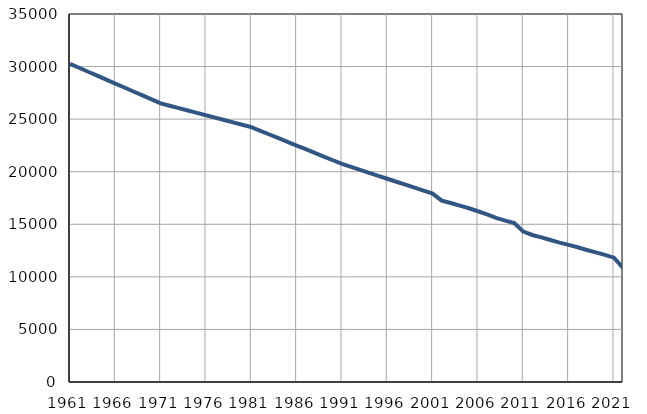
| Category | Број
становника |
|---|---|
| 1961.0 | 30260 |
| 1962.0 | 29885 |
| 1963.0 | 29509 |
| 1964.0 | 29134 |
| 1965.0 | 28758 |
| 1966.0 | 28383 |
| 1967.0 | 28007 |
| 1968.0 | 27632 |
| 1969.0 | 27256 |
| 1970.0 | 26881 |
| 1971.0 | 26505 |
| 1972.0 | 26279 |
| 1973.0 | 26052 |
| 1974.0 | 25826 |
| 1975.0 | 25600 |
| 1976.0 | 25374 |
| 1977.0 | 25147 |
| 1978.0 | 24920 |
| 1979.0 | 24694 |
| 1980.0 | 24467 |
| 1981.0 | 24242 |
| 1982.0 | 23892 |
| 1983.0 | 23541 |
| 1984.0 | 23191 |
| 1985.0 | 22841 |
| 1986.0 | 22490 |
| 1987.0 | 22141 |
| 1988.0 | 21790 |
| 1989.0 | 21440 |
| 1990.0 | 21090 |
| 1991.0 | 20740 |
| 1992.0 | 20458 |
| 1993.0 | 20176 |
| 1994.0 | 19894 |
| 1995.0 | 19611 |
| 1996.0 | 19330 |
| 1997.0 | 19047 |
| 1998.0 | 18765 |
| 1999.0 | 18483 |
| 2000.0 | 18201 |
| 2001.0 | 17919 |
| 2002.0 | 17248 |
| 2003.0 | 17022 |
| 2004.0 | 16779 |
| 2005.0 | 16525 |
| 2006.0 | 16240 |
| 2007.0 | 15935 |
| 2008.0 | 15617 |
| 2009.0 | 15344 |
| 2010.0 | 15112 |
| 2011.0 | 14304 |
| 2012.0 | 13982 |
| 2013.0 | 13755 |
| 2014.0 | 13507 |
| 2015.0 | 13255 |
| 2016.0 | 13037 |
| 2017.0 | 12811 |
| 2018.0 | 12557 |
| 2019.0 | 12322 |
| 2020.0 | 12098 |
| 2021.0 | 11822 |
| 2022.0 | 10844 |